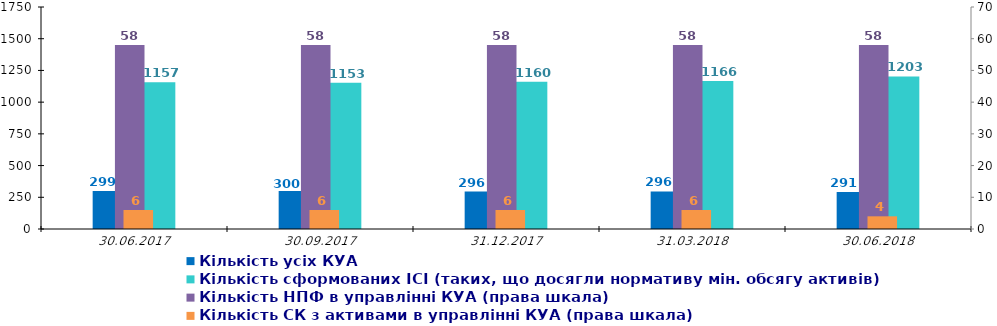
| Category | Кількість зареєстрованих ІСІ на одну КУА | Кількість усіх КУА | Кількість КУА з ІСІ в управлінні | Кількість сформованих ІСІ (таких, що досягли нормативу мін. обсягу активів)  |
|---|---|---|---|---|
| 30.06.2017 |  | 299 |  | 1157 |
| 30.09.2017 |  | 300 |  | 1153 |
| 31.12.2017 |  | 296 |  | 1160 |
| 31.03.2018 |  | 296 |  | 1166 |
| 30.06.2018 |  | 291 |  | 1203 |